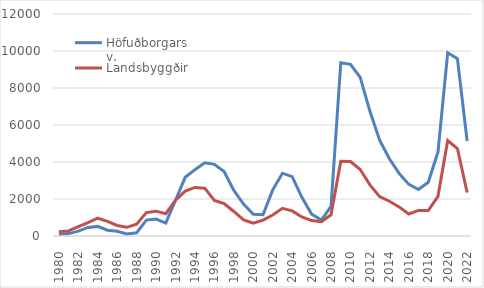
| Category | Höfuðborgarsv. | Landsbyggðin |
|---|---|---|
| 1980.0 | 101.107 | 230.205 |
| 1981.0 | 130.452 | 276.96 |
| 1982.0 | 263.822 | 505.155 |
| 1983.0 | 463.917 | 723 |
| 1984.0 | 519.417 | 961.25 |
| 1985.0 | 310.833 | 793.833 |
| 1986.0 | 253.167 | 569.667 |
| 1987.0 | 113.917 | 470.167 |
| 1988.0 | 176.833 | 642.75 |
| 1989.0 | 858.667 | 1266.5 |
| 1990.0 | 912.75 | 1342.583 |
| 1991.0 | 695.583 | 1204.917 |
| 1992.0 | 1932.75 | 1935.083 |
| 1993.0 | 3173.333 | 2428.083 |
| 1994.0 | 3584.333 | 2624.333 |
| 1995.0 | 3953.667 | 2584.75 |
| 1996.0 | 3871.75 | 1919.25 |
| 1997.0 | 3482.667 | 1747.75 |
| 1998.0 | 2462.5 | 1325.917 |
| 1999.0 | 1729.583 | 872.5 |
| 2000.0 | 1170 | 695 |
| 2001.0 | 1152 | 858 |
| 2002.0 | 2495 | 1135 |
| 2003.0 | 3394 | 1498 |
| 2004.0 | 3207 | 1357 |
| 2005.0 | 2093 | 1026 |
| 2006.0 | 1185 | 832 |
| 2007.0 | 861.917 | 770.333 |
| 2008.0 | 1600.167 | 1144.333 |
| 2009.0 | 9363.417 | 4043.333 |
| 2010.0 | 9281.167 | 4027.5 |
| 2011.0 | 8575.167 | 3592.167 |
| 2012.0 | 6739.333 | 2765.5 |
| 2013.0 | 5176 | 2128 |
| 2014.0 | 4172.833 | 1879.75 |
| 2015.0 | 3381.5 | 1573.583 |
| 2016.0 | 2790.667 | 1188.333 |
| 2017.0 | 2514.667 | 1384.333 |
| 2018.0 | 2904.25 | 1378.25 |
| 2019.0 | 4536.75 | 2143.583 |
| 2020.0 | 9907.5 | 5158.5 |
| 2021.0 | 9585.667 | 4727.417 |
| 2022.0 | 5136.167 | 2350.583 |